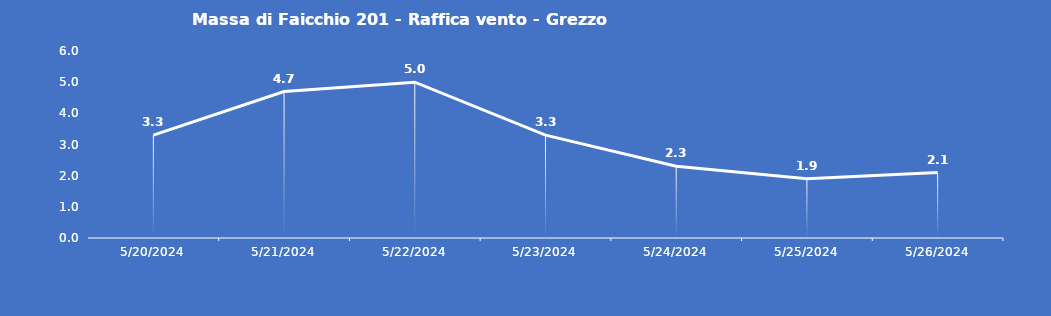
| Category | Massa di Faicchio 201 - Raffica vento - Grezzo (m/s) |
|---|---|
| 5/20/24 | 3.3 |
| 5/21/24 | 4.7 |
| 5/22/24 | 5 |
| 5/23/24 | 3.3 |
| 5/24/24 | 2.3 |
| 5/25/24 | 1.9 |
| 5/26/24 | 2.1 |